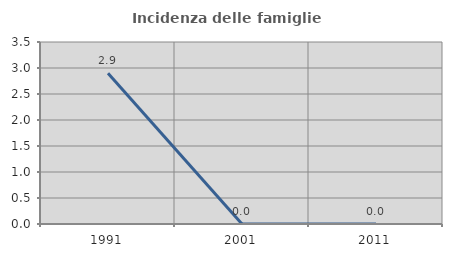
| Category | Incidenza delle famiglie numerose |
|---|---|
| 1991.0 | 2.899 |
| 2001.0 | 0 |
| 2011.0 | 0 |